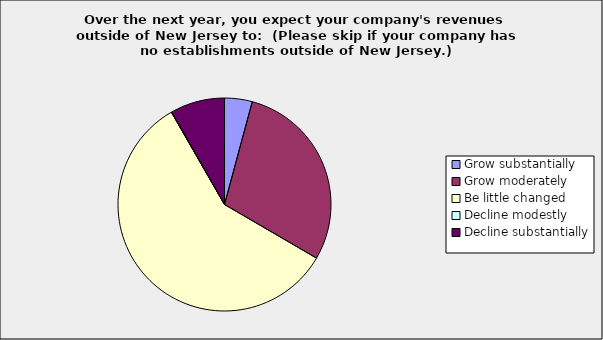
| Category | Series 0 |
|---|---|
| Grow substantially | 0.042 |
| Grow moderately | 0.292 |
| Be little changed | 0.583 |
| Decline modestly | 0 |
| Decline substantially | 0.083 |